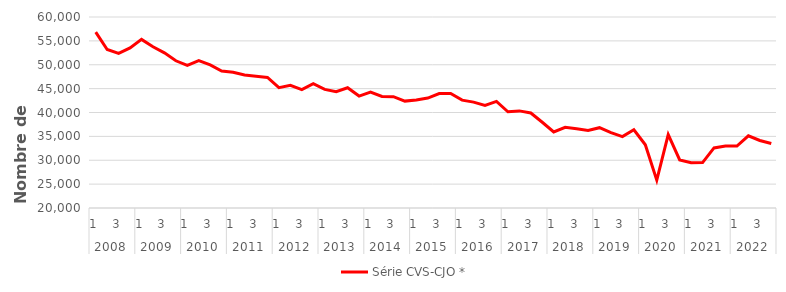
| Category | Série CVS-CJO * |
|---|---|
| 0 | 56819.704 |
| 1 | 53189.427 |
| 2 | 52379.594 |
| 3 | 53537.614 |
| 4 | 55311.391 |
| 5 | 53767.375 |
| 6 | 52502.774 |
| 7 | 50832.779 |
| 8 | 49861.414 |
| 9 | 50863.157 |
| 10 | 49972.606 |
| 11 | 48671.546 |
| 12 | 48414.285 |
| 13 | 47856.112 |
| 14 | 47603.694 |
| 15 | 47330.438 |
| 16 | 45213.192 |
| 17 | 45682.363 |
| 18 | 44791.885 |
| 19 | 46040.139 |
| 20 | 44837.076 |
| 21 | 44337.411 |
| 22 | 45179.839 |
| 23 | 43438.984 |
| 24 | 44259.062 |
| 25 | 43353.351 |
| 26 | 43314.093 |
| 27 | 42385.541 |
| 28 | 42597.391 |
| 29 | 43020.238 |
| 30 | 43964.799 |
| 31 | 44002.839 |
| 32 | 42588.369 |
| 33 | 42176.079 |
| 34 | 41466.961 |
| 35 | 42318.225 |
| 36 | 40154.154 |
| 37 | 40336.738 |
| 38 | 39893.957 |
| 39 | 37955.264 |
| 40 | 35935.502 |
| 41 | 36897.241 |
| 42 | 36585.859 |
| 43 | 36218.277 |
| 44 | 36821.253 |
| 45 | 35800.052 |
| 46 | 34944.679 |
| 47 | 36391.084 |
| 48 | 33249.976 |
| 49 | 25837.785 |
| 50 | 35370.47 |
| 51 | 30056.075 |
| 52 | 29463.384 |
| 53 | 29515.881 |
| 54 | 32585.454 |
| 55 | 32997.122 |
| 56 | 32977.678 |
| 57 | 35114.727 |
| 58 | 34138.499 |
| 59 | 33495.019 |